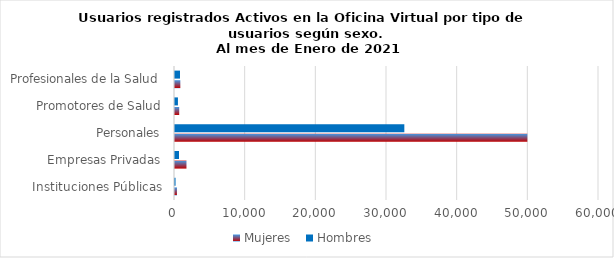
| Category | Mujeres | Hombres |
|---|---|---|
| Instituciones Públicas | 277 | 77 |
| Empresas Privadas | 1623 | 566 |
| Personales | 49861 | 32453 |
| Promotores de Salud | 596 | 415 |
| Profesionales de la Salud | 754 | 710 |